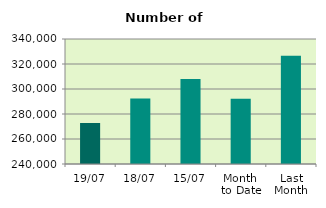
| Category | Series 0 |
|---|---|
| 19/07 | 272814 |
| 18/07 | 292450 |
| 15/07 | 307958 |
| Month 
to Date | 292118.154 |
| Last
Month | 326674.818 |